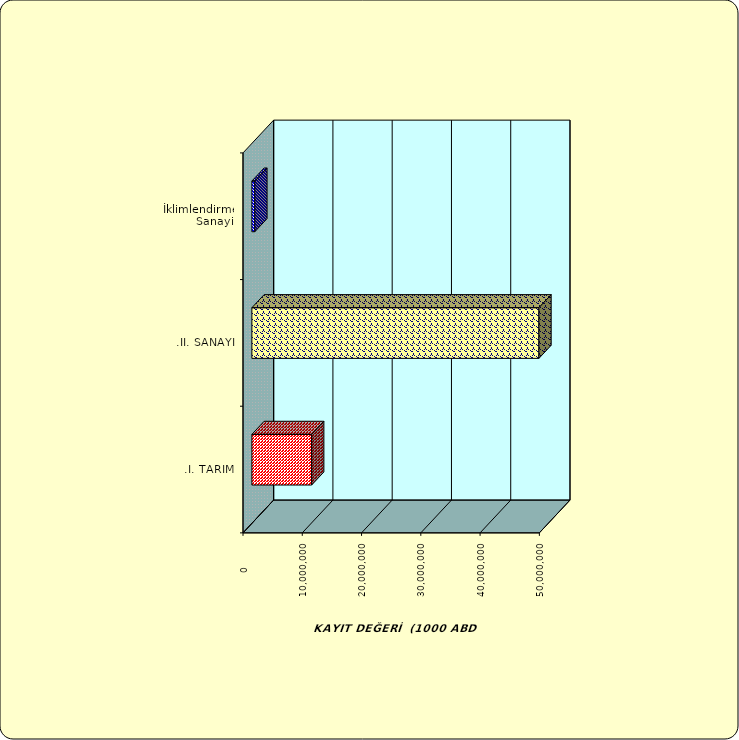
| Category | Series 0 |
|---|---|
| .I. TARIM | 10084756.118 |
| .II. SANAYİ | 48431514.593 |
|  İklimlendirme Sanayii | 497763.441 |